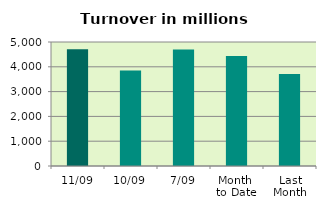
| Category | Series 0 |
|---|---|
| 11/09 | 4710.854 |
| 10/09 | 3851.306 |
| 7/09 | 4698.388 |
| Month 
to Date | 4436.005 |
| Last
Month | 3714.081 |